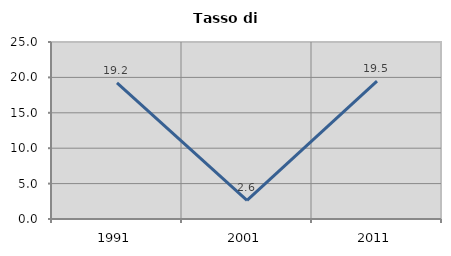
| Category | Tasso di disoccupazione   |
|---|---|
| 1991.0 | 19.22 |
| 2001.0 | 2.632 |
| 2011.0 | 19.461 |